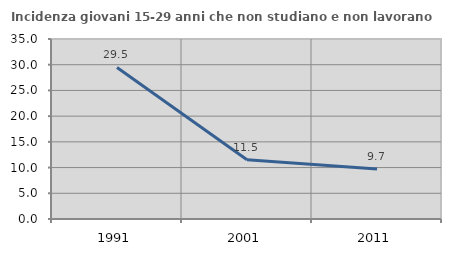
| Category | Incidenza giovani 15-29 anni che non studiano e non lavorano  |
|---|---|
| 1991.0 | 29.467 |
| 2001.0 | 11.532 |
| 2011.0 | 9.738 |